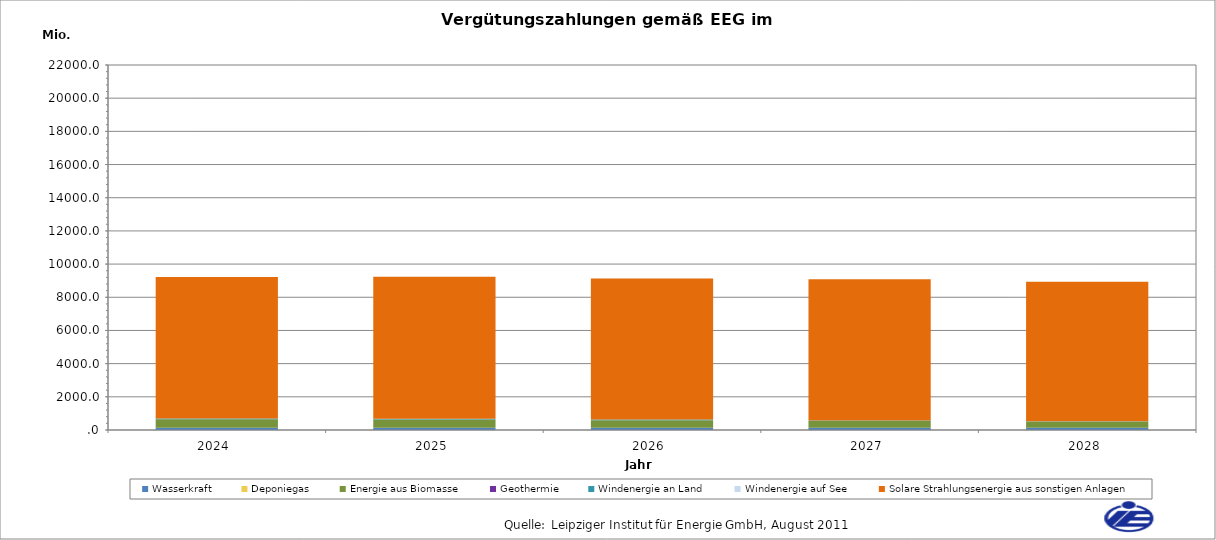
| Category | Wasserkraft | Deponiegas | Energie aus Biomasse | Geothermie | Windenergie an Land | Windenergie auf See | Solare Strahlungsenergie aus sonstigen Anlagen |
|---|---|---|---|---|---|---|---|
| 2024.0 | 129.227 | 1.384 | 520.267 | 1.236 | 46.392 | 0 | 8523.933 |
| 2025.0 | 129.082 | 1.199 | 505.871 | 1.236 | 41.212 | 0 | 8558.56 |
| 2026.0 | 128.937 | 0.993 | 462.1 | 1.236 | 35.265 | 0 | 8503.878 |
| 2027.0 | 128.792 | 0.779 | 416.489 | 1.236 | 20.571 | 0 | 8513.158 |
| 2028.0 | 128.648 | 0.657 | 380.119 | 0.195 | 13.187 | 0 | 8414.704 |